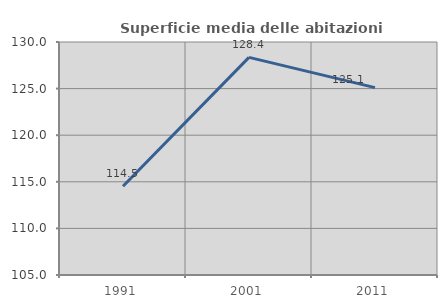
| Category | Superficie media delle abitazioni occupate |
|---|---|
| 1991.0 | 114.517 |
| 2001.0 | 128.355 |
| 2011.0 | 125.106 |